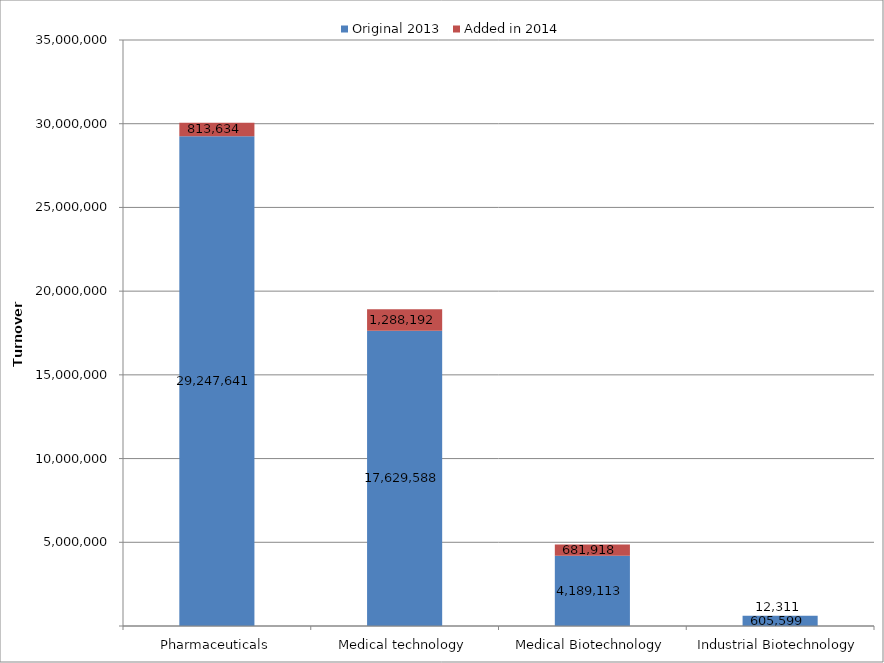
| Category | Original 2013 | Added in 2014 |
|---|---|---|
| Pharmaceuticals | 29247641.163 | 813633.591 |
| Medical technology | 17629588.177 | 1288191.742 |
| Medical Biotechnology | 4189112.601 | 681917.797 |
| Industrial Biotechnology | 605599.041 | 12310.877 |